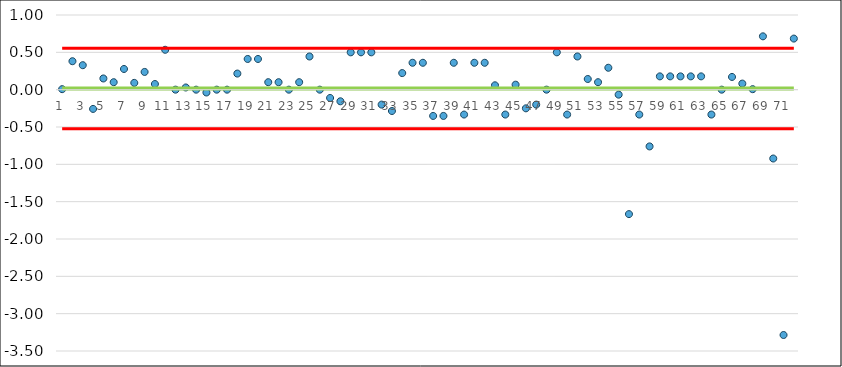
| Category | Series 0 | Series 1 | S1 | S2 |
|---|---|---|---|---|
| 0 | 0.007 | 0.015 | 0.554 | -0.524 |
| 1 | 0.381 | 0.015 | 0.554 | -0.524 |
| 2 | 0.328 | 0.015 | 0.554 | -0.524 |
| 3 | -0.258 | 0.015 | 0.554 | -0.524 |
| 4 | 0.15 | 0.015 | 0.554 | -0.524 |
| 5 | 0.1 | 0.015 | 0.554 | -0.524 |
| 6 | 0.277 | 0.015 | 0.554 | -0.524 |
| 7 | 0.091 | 0.015 | 0.554 | -0.524 |
| 8 | 0.237 | 0.015 | 0.554 | -0.524 |
| 9 | 0.076 | 0.015 | 0.554 | -0.524 |
| 10 | 0.534 | 0.015 | 0.554 | -0.524 |
| 11 | 0 | 0.015 | 0.554 | -0.524 |
| 12 | 0.029 | 0.015 | 0.554 | -0.524 |
| 13 | 0 | 0.015 | 0.554 | -0.524 |
| 14 | -0.038 | 0.015 | 0.554 | -0.524 |
| 15 | 0 | 0.015 | 0.554 | -0.524 |
| 16 | 0 | 0.015 | 0.554 | -0.524 |
| 17 | 0.216 | 0.015 | 0.554 | -0.524 |
| 18 | 0.411 | 0.015 | 0.554 | -0.524 |
| 19 | 0.411 | 0.015 | 0.554 | -0.524 |
| 20 | 0.1 | 0.015 | 0.554 | -0.524 |
| 21 | 0.1 | 0.015 | 0.554 | -0.524 |
| 22 | 0 | 0.015 | 0.554 | -0.524 |
| 23 | 0.1 | 0.015 | 0.554 | -0.524 |
| 24 | 0.444 | 0.015 | 0.554 | -0.524 |
| 25 | 0 | 0.015 | 0.554 | -0.524 |
| 26 | -0.111 | 0.015 | 0.554 | -0.524 |
| 27 | -0.156 | 0.015 | 0.554 | -0.524 |
| 28 | 0.5 | 0.015 | 0.554 | -0.524 |
| 29 | 0.5 | 0.015 | 0.554 | -0.524 |
| 30 | 0.5 | 0.015 | 0.554 | -0.524 |
| 31 | -0.2 | 0.015 | 0.554 | -0.524 |
| 32 | -0.286 | 0.015 | 0.554 | -0.524 |
| 33 | 0.222 | 0.015 | 0.554 | -0.524 |
| 34 | 0.36 | 0.015 | 0.554 | -0.524 |
| 35 | 0.36 | 0.015 | 0.554 | -0.524 |
| 36 | -0.352 | 0.015 | 0.554 | -0.524 |
| 37 | -0.352 | 0.015 | 0.554 | -0.524 |
| 38 | 0.36 | 0.015 | 0.554 | -0.524 |
| 39 | -0.333 | 0.015 | 0.554 | -0.524 |
| 40 | 0.36 | 0.015 | 0.554 | -0.524 |
| 41 | 0.36 | 0.015 | 0.554 | -0.524 |
| 42 | 0.059 | 0.015 | 0.554 | -0.524 |
| 43 | -0.333 | 0.015 | 0.554 | -0.524 |
| 44 | 0.067 | 0.015 | 0.554 | -0.524 |
| 45 | -0.25 | 0.015 | 0.554 | -0.524 |
| 46 | -0.2 | 0.015 | 0.554 | -0.524 |
| 47 | 0 | 0.015 | 0.554 | -0.524 |
| 48 | 0.5 | 0.015 | 0.554 | -0.524 |
| 49 | -0.333 | 0.015 | 0.554 | -0.524 |
| 50 | 0.444 | 0.015 | 0.554 | -0.524 |
| 51 | 0.143 | 0.015 | 0.554 | -0.524 |
| 52 | 0.1 | 0.015 | 0.554 | -0.524 |
| 53 | 0.293 | 0.015 | 0.554 | -0.524 |
| 54 | -0.067 | 0.015 | 0.554 | -0.524 |
| 55 | -1.667 | 0.015 | 0.554 | -0.524 |
| 56 | -0.333 | 0.015 | 0.554 | -0.524 |
| 57 | -0.76 | 0.015 | 0.554 | -0.524 |
| 58 | 0.178 | 0.015 | 0.554 | -0.524 |
| 59 | 0.178 | 0.015 | 0.554 | -0.524 |
| 60 | 0.178 | 0.015 | 0.554 | -0.524 |
| 61 | 0.178 | 0.015 | 0.554 | -0.524 |
| 62 | 0.178 | 0.015 | 0.554 | -0.524 |
| 63 | -0.333 | 0.015 | 0.554 | -0.524 |
| 64 | 0 | 0.015 | 0.554 | -0.524 |
| 65 | 0.17 | 0.015 | 0.554 | -0.524 |
| 66 | 0.081 | 0.015 | 0.554 | -0.524 |
| 67 | 0.007 | 0.015 | 0.554 | -0.524 |
| 68 | 0.714 | 0.015 | 0.554 | -0.524 |
| 69 | -0.922 | 0.015 | 0.554 | -0.524 |
| 70 | -3.286 | 0.015 | 0.554 | -0.524 |
| 71 | 0.684 | 0.015 | 0.554 | -0.524 |